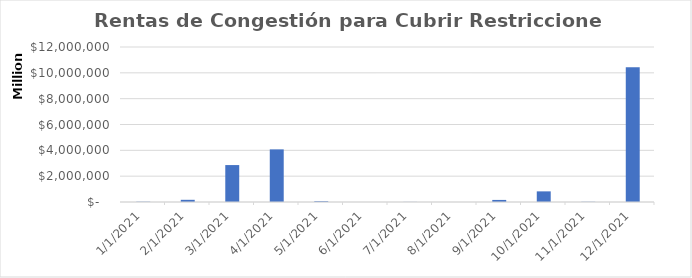
| Category | Rentas de Congestión para Cubrir Restricciones (COP) |
|---|---|
| 1/1/21 | 21252175660 |
| 2/1/21 | 169606165870 |
| 3/1/21 | 2859152035670 |
| 4/1/21 | 4073965463770 |
| 5/1/21 | 60037276720 |
| 6/1/21 | 34568320 |
| 7/1/21 | 8136443630 |
| 8/1/21 | 1584195290 |
| 9/1/21 | 160444686170 |
| 10/1/21 | 823297745770 |
| 11/1/21 | 16014185380 |
| 12/1/21 | 10441274329390 |